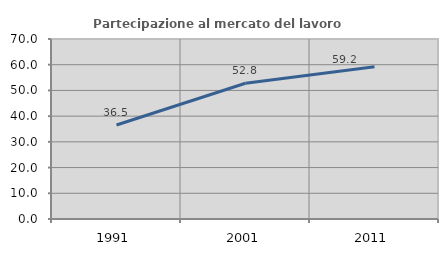
| Category | Partecipazione al mercato del lavoro  femminile |
|---|---|
| 1991.0 | 36.538 |
| 2001.0 | 52.772 |
| 2011.0 | 59.23 |